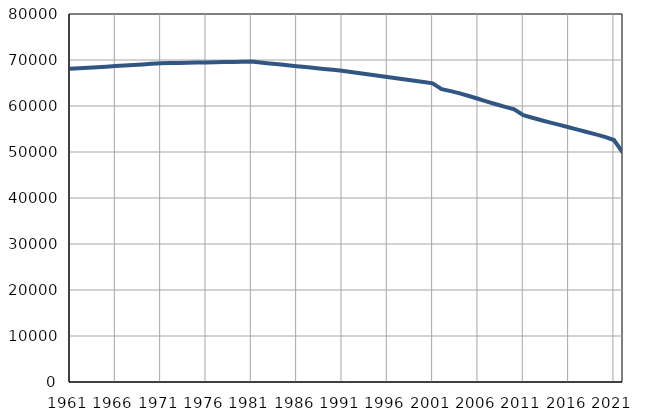
| Category | Број
становника |
|---|---|
| 1961.0 | 68073 |
| 1962.0 | 68194 |
| 1963.0 | 68315 |
| 1964.0 | 68437 |
| 1965.0 | 68558 |
| 1966.0 | 68679 |
| 1967.0 | 68800 |
| 1968.0 | 68921 |
| 1969.0 | 69043 |
| 1970.0 | 69164 |
| 1971.0 | 69285 |
| 1972.0 | 69322 |
| 1973.0 | 69358 |
| 1974.0 | 69395 |
| 1975.0 | 69432 |
| 1976.0 | 69468 |
| 1977.0 | 69506 |
| 1978.0 | 69543 |
| 1979.0 | 69579 |
| 1980.0 | 69616 |
| 1981.0 | 69653 |
| 1982.0 | 69454 |
| 1983.0 | 69254 |
| 1984.0 | 69055 |
| 1985.0 | 68855 |
| 1986.0 | 68656 |
| 1987.0 | 68455 |
| 1988.0 | 68256 |
| 1989.0 | 68057 |
| 1990.0 | 67857 |
| 1991.0 | 67658 |
| 1992.0 | 67384 |
| 1993.0 | 67111 |
| 1994.0 | 66837 |
| 1995.0 | 66563 |
| 1996.0 | 66290 |
| 1997.0 | 66017 |
| 1998.0 | 65743 |
| 1999.0 | 65469 |
| 2000.0 | 65195 |
| 2001.0 | 64922 |
| 2002.0 | 63679 |
| 2003.0 | 63229 |
| 2004.0 | 62735 |
| 2005.0 | 62174 |
| 2006.0 | 61578 |
| 2007.0 | 60966 |
| 2008.0 | 60376 |
| 2009.0 | 59825 |
| 2010.0 | 59263 |
| 2011.0 | 57997 |
| 2012.0 | 57440 |
| 2013.0 | 56903 |
| 2014.0 | 56396 |
| 2015.0 | 55885 |
| 2016.0 | 55381 |
| 2017.0 | 54873 |
| 2018.0 | 54342 |
| 2019.0 | 53824 |
| 2020.0 | 53281 |
| 2021.0 | 52602 |
| 2022.0 | 49792 |